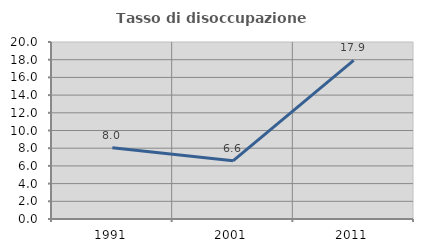
| Category | Tasso di disoccupazione giovanile  |
|---|---|
| 1991.0 | 8.04 |
| 2001.0 | 6.569 |
| 2011.0 | 17.925 |